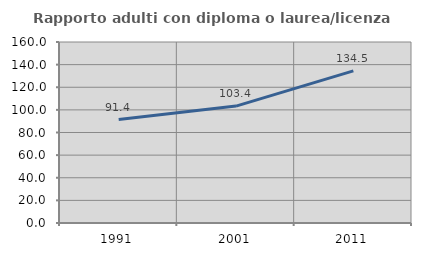
| Category | Rapporto adulti con diploma o laurea/licenza media  |
|---|---|
| 1991.0 | 91.409 |
| 2001.0 | 103.365 |
| 2011.0 | 134.461 |